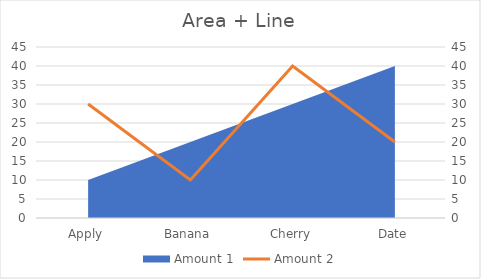
| Category | Amount 2 |
|---|---|
| Apply | 30 |
| Banana | 10 |
| Cherry | 40 |
| Date | 20 |